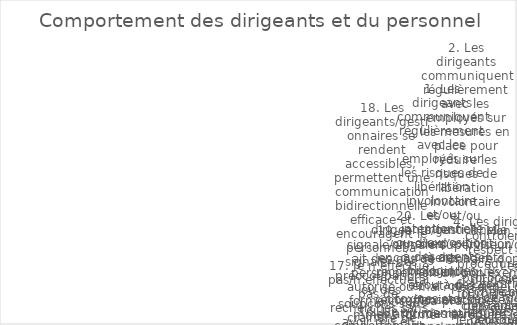
| Category | Series 0 |
|---|---|
| 1. Les dirigeants communiquent régulièrement avec les employés sur les risques de libération involontaire et/ou intentionnelle ou d’exposition à des agents biologiques et/ou à des toxines stockés ou manipulés dans mon installation. | 1 |
| 2. Les dirigeants communiquent régulièrement avec les employés sur les mesures en place pour réduire les risques de libération involontaire et/ou intentionnelle ou d’exposition à des agents biologiques et/ou à des toxines stockés ou manipulés dans mon ins | 1 |
| 3. Mon superviseur/gestionnaire donne un bon exemple personnel de pratiques visant à réduire les risques biologiques. | 1 |
| 4. Les dirigeants contrôlent le respect des procédures (ou protocoles de recherche) et des règles de conduite approuvées/validées. | 1 |
| 5. Les dirigeants fournissent les moyens nécessaires pour mettre en œuvre des mesures de biosécurité et de biosûreté. | 0 |
| 6. Les dirigeants de mon organisation encouragent les employés à accroître leur éducation et leur sensibilisation aux risques biologiques. | 1 |
| 7. Je suis convaincu que je peux déclarer moi-même une maladie ou d’autres conditions susceptibles d’affecter la biosécurité/biosûreté sans crainte de perdre mon emploi ni d’autres effets négatifs sur ma vie professionnelle/ma carrière.  | 0 |
| 8. Il n’est jamais approprié de suivre (« ferroutage ») un employé autorisé à entrer dans une zone réglementée. | 0 |
| 9. Je signale/signalerait un comportement inhabituel de mes collègues qui augmente le risque de libération involontaire et/ou intentionnelle d’agents biologiques et/ou de toxines, ou d’exposition à ces agents. | 0 |
| 10. Je suis engagé dans les processus d’évaluation des risques et de prise de décision pour réduire le risque de libération involontaire et/ou intentionnelle d’agents biologiques et/ou de toxines stockés ou manipulés dans mon installation. | 3 |
| 11. Mon organisation valorise la vigilance en matière de biosécurité et de biosûreté. | 5 |
| 12. Dans mon organisation, des mesures sont en place pour punir les violations délibérées de la biosécurité et de la biosûreté. | 5 |
| 13. Les dirigeants communiquent avec le personnel sur les attentes de performance spécifiques dans les domaines qui affectent la biosécurité et la biosûreté. | 3 |
| 14. Les employés participent aux processus d’évaluation des risques et de prise de décision et aux autres activités qui les concernent.  | 4 |
| 15. Tout le monde dans mon installation dispose correctement des matériaux contaminés. | 5 |
| 16. Un comportement qui améliore la culture de biosécurité et de biosûreté est renforcé par mes pairs. | 3 |
| 17. Je n’effectue pas/n’effectuerai pas de recherches sans avoir mis en place des mesures appropriées d’atténuation de risques. | 4 |
| 18. Les dirigeants/gestionnaires se rendent accessibles, permettent une communication bidirectionnelle efficace et encouragent le personnel à signaler des préoccupations ou des soupçons sans craindre de subir par la suite des mesures disciplinaires4. | 0 |
| 19. Je signale/signalerait des cas de personnel non autorisé ou mal formé/insuffisamment formé accédant à l’établissement.  | 0 |
| 20. Les dirigeants/gestionnaires encouragent, reconnaissent et récompensent les attitudes et comportements louables. | 2 |